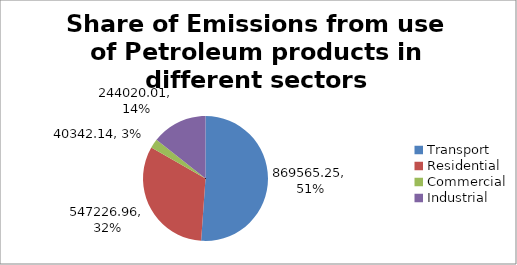
| Category | Contribution |
|---|---|
| Transport | 869565.25 |
| Residential | 547226.96 |
| Commercial | 40342.14 |
| Industrial | 244020.01 |